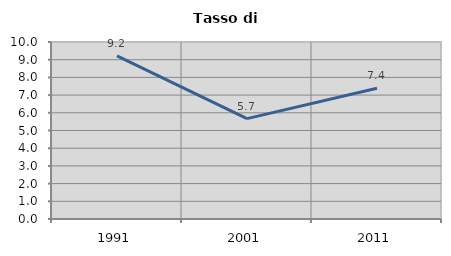
| Category | Tasso di disoccupazione   |
|---|---|
| 1991.0 | 9.219 |
| 2001.0 | 5.672 |
| 2011.0 | 7.386 |